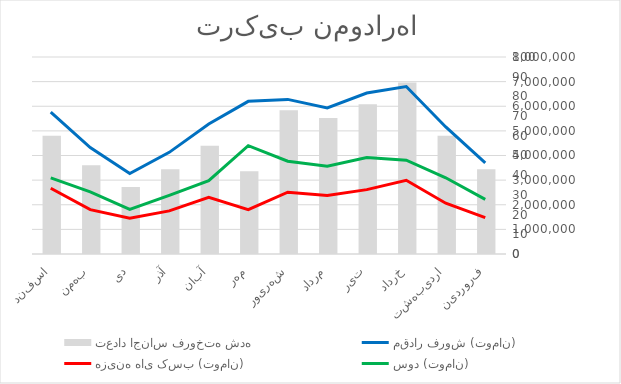
| Category | تعداد اجناس فروخته شده |
|---|---|
| فروردین | 43 |
| اردیبهشت | 60 |
| خرداد | 87 |
| تیر | 76 |
| مرداد | 69 |
| شهریور | 73 |
| مهر | 42 |
| آبان | 55 |
| آذر | 43 |
| دی | 34 |
| بهمن | 45 |
| اسفند | 60 |